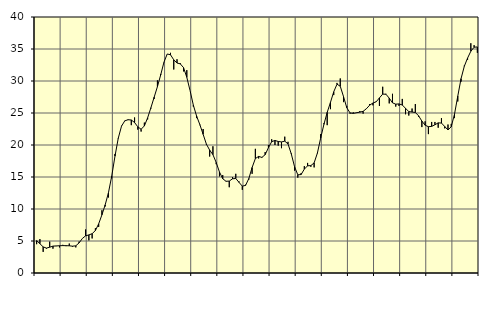
| Category | Piggar | Series 1 |
|---|---|---|
| nan | 4.5 | 5.07 |
| 87.0 | 5.3 | 4.58 |
| 87.0 | 3.3 | 4.08 |
| 87.0 | 3.8 | 3.89 |
| nan | 4.9 | 4.03 |
| 88.0 | 3.8 | 4.2 |
| 88.0 | 4.2 | 4.23 |
| 88.0 | 4 | 4.26 |
| nan | 4.4 | 4.28 |
| 89.0 | 4.2 | 4.27 |
| 89.0 | 4.6 | 4.25 |
| 89.0 | 4.1 | 4.19 |
| nan | 4 | 4.25 |
| 90.0 | 4.9 | 4.7 |
| 90.0 | 5.4 | 5.39 |
| 90.0 | 6.8 | 5.81 |
| nan | 5.1 | 5.95 |
| 91.0 | 5.4 | 6.14 |
| 91.0 | 7 | 6.64 |
| 91.0 | 7.2 | 7.68 |
| nan | 9.8 | 9.09 |
| 92.0 | 10.4 | 10.65 |
| 92.0 | 11.8 | 12.55 |
| 92.0 | 14.8 | 15.14 |
| nan | 18.6 | 18.26 |
| 93.0 | 21 | 21.06 |
| 93.0 | 23 | 22.94 |
| 93.0 | 23.8 | 23.77 |
| nan | 23.9 | 23.95 |
| 94.0 | 23.1 | 23.91 |
| 94.0 | 24.3 | 23.51 |
| 94.0 | 22.4 | 22.84 |
| nan | 22.1 | 22.46 |
| 95.0 | 23.5 | 22.98 |
| 95.0 | 24 | 24.25 |
| 95.0 | 25.7 | 25.82 |
| nan | 27.2 | 27.47 |
| 96.0 | 30.1 | 29.12 |
| 96.0 | 31.1 | 30.95 |
| 96.0 | 32.9 | 32.94 |
| nan | 34.2 | 34.22 |
| 97.0 | 34.4 | 34.1 |
| 97.0 | 31.8 | 33.31 |
| 97.0 | 33.4 | 32.81 |
| nan | 32.8 | 32.68 |
| 98.0 | 31.5 | 32.09 |
| 98.0 | 31.7 | 30.58 |
| 98.0 | 28.5 | 28.5 |
| nan | 26 | 26.23 |
| 99.0 | 24.2 | 24.52 |
| 99.0 | 23.1 | 23.18 |
| 99.0 | 22.5 | 21.67 |
| nan | 20 | 20.13 |
| 0.0 | 18.2 | 19.2 |
| 0.0 | 19.8 | 18.49 |
| 0.0 | 17 | 17.27 |
| nan | 15.1 | 15.78 |
| 1.0 | 15.3 | 14.73 |
| 1.0 | 14.3 | 14.33 |
| 1.0 | 13.4 | 14.36 |
| nan | 15 | 14.72 |
| 2.0 | 15.5 | 14.77 |
| 2.0 | 14.3 | 14.16 |
| 2.0 | 13 | 13.57 |
| nan | 13.8 | 13.69 |
| 3.0 | 14.6 | 14.76 |
| 3.0 | 15.5 | 16.48 |
| 3.0 | 19.4 | 17.88 |
| nan | 17.9 | 18.22 |
| 4.0 | 18 | 18.06 |
| 4.0 | 18.9 | 18.49 |
| 4.0 | 20 | 19.58 |
| nan | 20.9 | 20.52 |
| 5.0 | 20 | 20.71 |
| 5.0 | 19.9 | 20.55 |
| 5.0 | 19.5 | 20.48 |
| nan | 21.3 | 20.6 |
| 6.0 | 20.5 | 20.17 |
| 6.0 | 18.7 | 18.62 |
| 6.0 | 16 | 16.62 |
| nan | 14.9 | 15.34 |
| 7.0 | 15.6 | 15.38 |
| 7.0 | 16.7 | 16.23 |
| 7.0 | 17.2 | 16.75 |
| nan | 16.6 | 16.78 |
| 8.0 | 16.5 | 17.21 |
| 8.0 | 18.7 | 18.74 |
| 8.0 | 21.7 | 21.08 |
| nan | 23.4 | 23.23 |
| 9.0 | 23.1 | 25.1 |
| 9.0 | 25.6 | 26.66 |
| 9.0 | 27.8 | 28.31 |
| nan | 29.7 | 29.5 |
| 10.0 | 30.4 | 29.18 |
| 10.0 | 26.7 | 27.57 |
| 10.0 | 26.1 | 25.83 |
| nan | 24.9 | 25.01 |
| 11.0 | 25.1 | 24.94 |
| 11.0 | 25 | 25.04 |
| 11.0 | 25.3 | 25.13 |
| nan | 24.9 | 25.26 |
| 12.0 | 25.7 | 25.66 |
| 12.0 | 26.4 | 26.22 |
| 12.0 | 26.2 | 26.56 |
| nan | 26.8 | 26.75 |
| 13.0 | 26.1 | 27.36 |
| 13.0 | 29.1 | 27.95 |
| 13.0 | 28 | 27.93 |
| nan | 26.5 | 27.32 |
| 14.0 | 28 | 26.59 |
| 14.0 | 26 | 26.38 |
| 14.0 | 26.1 | 26.42 |
| nan | 27.2 | 26.25 |
| 15.0 | 24.8 | 25.73 |
| 15.0 | 24.6 | 25.22 |
| 15.0 | 25.7 | 25.15 |
| nan | 26.4 | 25.08 |
| 16.0 | 24.4 | 24.56 |
| 16.0 | 22.8 | 23.74 |
| 16.0 | 23.7 | 23.09 |
| nan | 21.7 | 22.86 |
| 17.0 | 23.6 | 22.91 |
| 17.0 | 23.6 | 23.16 |
| 17.0 | 22.7 | 23.46 |
| nan | 24.2 | 23.43 |
| 18.0 | 22.6 | 22.89 |
| 18.0 | 23.2 | 22.35 |
| 18.0 | 23.3 | 22.86 |
| nan | 24.2 | 24.82 |
| 19.0 | 26.8 | 27.63 |
| 19.0 | 29.9 | 30.36 |
| 19.0 | 32.4 | 32.3 |
| nan | 33.3 | 33.58 |
| 20.0 | 35.9 | 34.65 |
| 20.0 | 35.6 | 35.28 |
| 20.0 | 34.4 | 35.32 |